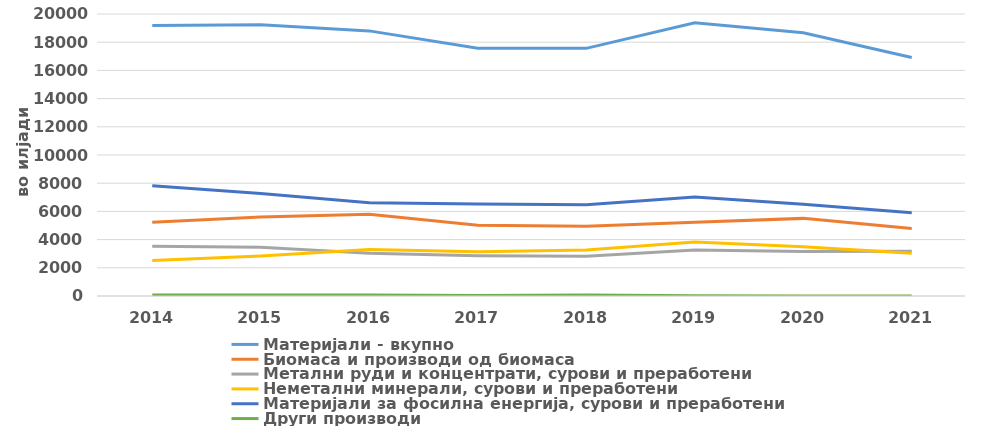
| Category | Материјали - вкупно | Биомаса и производи од биомаса | Метални руди и концентрати, сурови и преработени | Неметални минерали, сурови и преработени | Материјали за фoсилна енергија, сурови и преработени | Други производи |
|---|---|---|---|---|---|---|
| 2014.0 | 19189 | 5236 | 3537 | 2521 | 7827 | 68 |
| 2015.0 | 19235.336 | 5599.568 | 3461.391 | 2840.001 | 7263.494 | 70.883 |
| 2016.0 | 18802.092 | 5799.273 | 3024.223 | 3290.775 | 6618.795 | 69.025 |
| 2017.0 | 17575.452 | 5018.313 | 2863.067 | 3135.06 | 6523.838 | 35.174 |
| 2018.0 | 17564.188 | 4943.988 | 2816.009 | 3260.181 | 6470.23 | 73.781 |
| 2019.0 | 19379 | 5238 | 3265 | 3828 | 7025 | 23 |
| 2020.0 | 18675.295 | 5505.211 | 3157.847 | 3499.71 | 6506.243 | 6.285 |
| 2021.0 | 16909.756 | 4784.603 | 3181.373 | 3031.33 | 5912.449 | 0 |